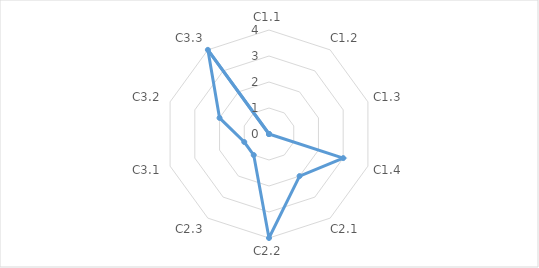
| Category | Series 0 | "" | 1 | 2 | 3 | 4 |
|---|---|---|---|---|---|---|
| C1.1 | 0 |  |  |  |  |  |
| C1.2 | 0 |  |  |  |  |  |
| C1.3 | 0 |  |  |  |  |  |
| C1.4 | 3 |  |  |  |  |  |
| C2.1 | 2 |  |  |  |  |  |
| C2.2 | 4 |  |  |  |  |  |
| C2.3 | 1 |  |  |  |  |  |
| C3.1 | 1 |  |  |  |  |  |
| C3.2 | 2 |  |  |  |  |  |
| C3.3 | 4 |  |  |  |  |  |